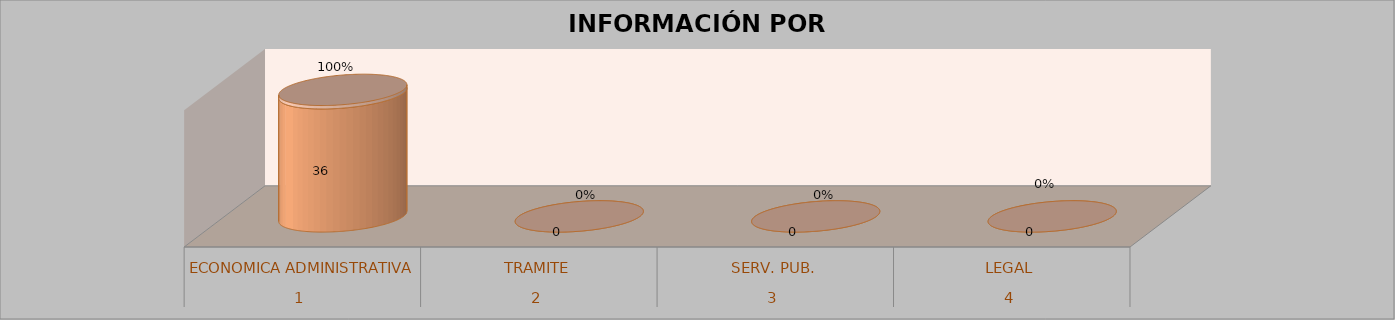
| Category | Series 0 | Series 1 | Series 2 | Series 3 |
|---|---|---|---|---|
| 0 |  |  | 36 | 1 |
| 1 |  |  | 0 | 0 |
| 2 |  |  | 0 | 0 |
| 3 |  |  | 0 | 0 |